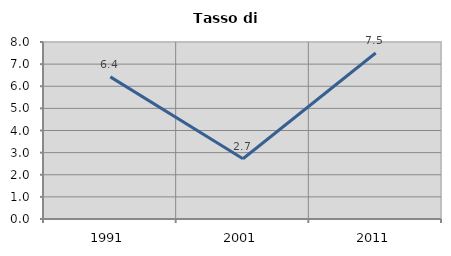
| Category | Tasso di disoccupazione   |
|---|---|
| 1991.0 | 6.423 |
| 2001.0 | 2.723 |
| 2011.0 | 7.504 |